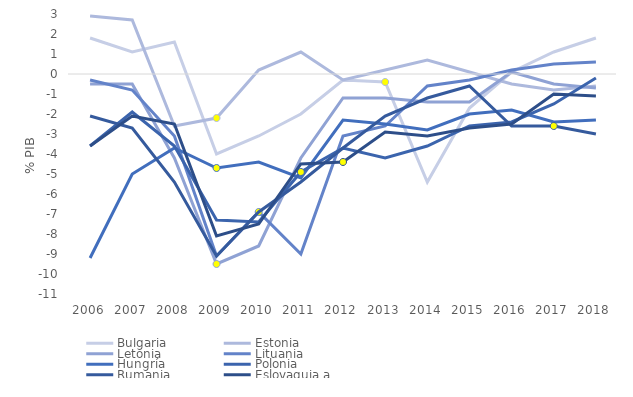
| Category | Bulgaria | Estonia | Letonia | Lituania | Hungría | Polonia | Rumania | Eslovaquia a  |
|---|---|---|---|---|---|---|---|---|
| 2006.0 | 1.8 | 2.9 | -0.5 | -0.3 | -9.2 | -3.6 | -2.1 | -3.6 |
| 2007.0 | 1.1 | 2.7 | -0.5 | -0.8 | -5 | -1.9 | -2.7 | -2.1 |
| 2008.0 | 1.6 | -2.6 | -4.2 | -3.1 | -3.7 | -3.6 | -5.4 | -2.5 |
| 2009.0 | -4 | -2.2 | -9.5 | -9.1 | -4.7 | -7.3 | -9.1 | -8.1 |
| 2010.0 | -3.1 | 0.2 | -8.6 | -6.9 | -4.4 | -7.4 | -6.9 | -7.5 |
| 2011.0 | -2 | 1.1 | -4.2 | -9 | -5.2 | -4.9 | -5.4 | -4.5 |
| 2012.0 | -0.3 | -0.3 | -1.2 | -3.1 | -2.3 | -3.7 | -3.7 | -4.4 |
| 2013.0 | -0.4 | 0.2 | -1.2 | -2.6 | -2.5 | -4.2 | -2.1 | -2.9 |
| 2014.0 | -5.4 | 0.7 | -1.4 | -0.6 | -2.8 | -3.6 | -1.2 | -3.1 |
| 2015.0 | -1.7 | 0.1 | -1.4 | -0.3 | -2 | -2.6 | -0.6 | -2.7 |
| 2016.0 | 0.1 | -0.5 | 0.1 | 0.2 | -1.8 | -2.4 | -2.6 | -2.5 |
| 2017.0 | 1.1 | -0.8 | -0.5 | 0.5 | -2.4 | -1.5 | -2.6 | -1 |
| 2018.0 | 1.8 | -0.6 | -0.7 | 0.6 | -2.3 | -0.2 | -3 | -1.1 |